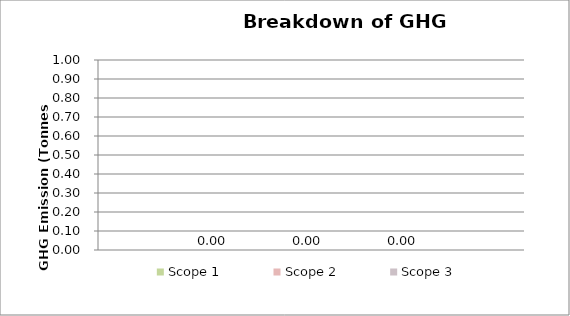
| Category | Scope 1 | Scope 2 | Scope 3 |
|---|---|---|---|
| 0 | 0 | 0 | 0 |